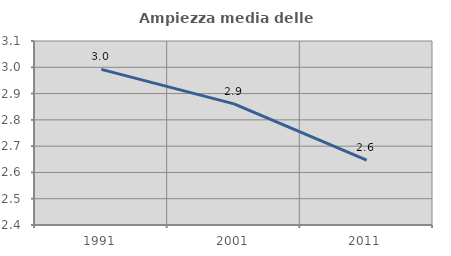
| Category | Ampiezza media delle famiglie |
|---|---|
| 1991.0 | 2.992 |
| 2001.0 | 2.861 |
| 2011.0 | 2.647 |